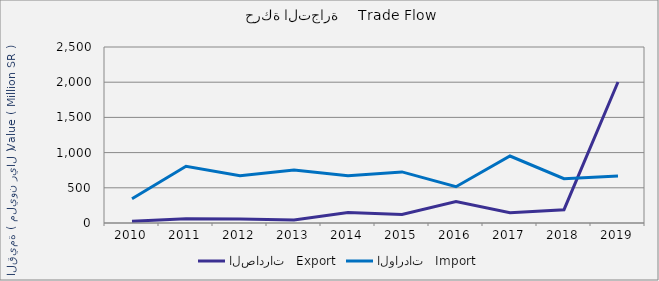
| Category | الصادرات   Export | الواردات   Import |
|---|---|---|
| 2010.0 | 23437622 | 343705040 |
| 2011.0 | 59070447 | 805451322 |
| 2012.0 | 55319773 | 671022594 |
| 2013.0 | 43289248 | 752591409 |
| 2014.0 | 150379687 | 671759083 |
| 2015.0 | 120358327 | 725905673 |
| 2016.0 | 304259679 | 515387948 |
| 2017.0 | 146554074 | 951209444 |
| 2018.0 | 189031378 | 628544598 |
| 2019.0 | 2002344354 | 668007273 |